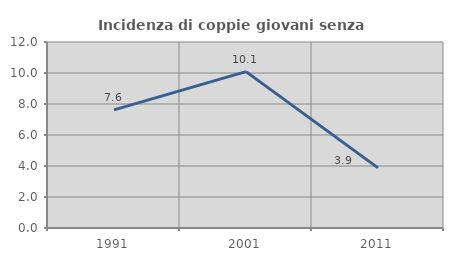
| Category | Incidenza di coppie giovani senza figli |
|---|---|
| 1991.0 | 7.617 |
| 2001.0 | 10.086 |
| 2011.0 | 3.88 |